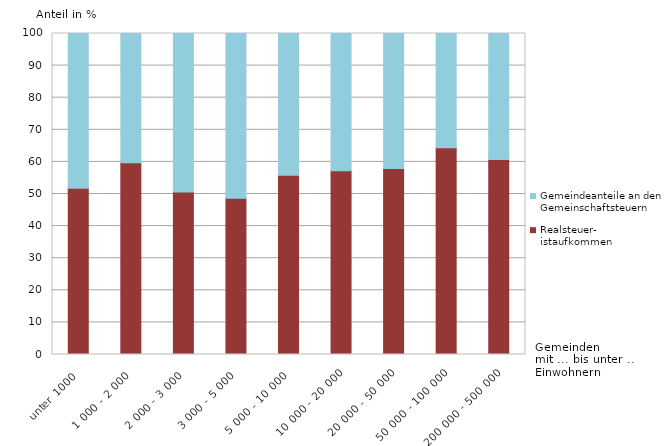
| Category | Realsteuer-
istaufkommen | Gemeindeanteile an den 
Gemeinschaftsteuern |
|---|---|---|
| unter 1000 | 51.796 | 48.204 |
| 1 000 - 2 000 | 59.703 | 40.297 |
| 2 000 - 3 000 | 50.652 | 49.348 |
| 3 000 - 5 000 | 48.706 | 51.294 |
| 5 000 - 10 000 | 55.807 | 44.193 |
| 10 000 - 20 000 | 57.254 | 42.746 |
| 20 000 - 50 000 | 57.924 | 42.076 |
| 50 000 - 100 000 | 64.429 | 35.571 |
| 200 000 - 500 000 | 60.755 | 39.245 |